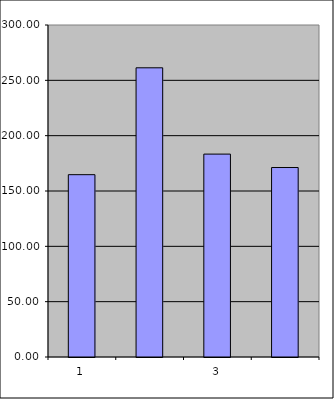
| Category | Series 0 |
|---|---|
| 0 | 164.75 |
| 1 | 261.321 |
| 2 | 183.344 |
| 3 | 171.211 |